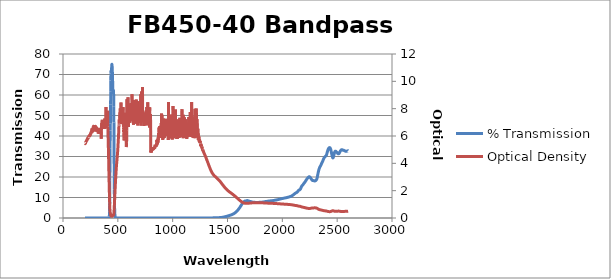
| Category | % Transmission |
|---|---|
| 2600.0 | 32.757 |
| 2599.0 | 32.808 |
| 2598.0 | 32.765 |
| 2597.0 | 32.746 |
| 2596.0 | 32.73 |
| 2595.0 | 32.687 |
| 2594.0 | 32.692 |
| 2593.0 | 32.692 |
| 2592.0 | 32.68 |
| 2591.0 | 32.648 |
| 2590.0 | 32.629 |
| 2589.0 | 32.581 |
| 2588.0 | 32.602 |
| 2587.0 | 32.576 |
| 2586.0 | 32.598 |
| 2585.0 | 32.576 |
| 2584.0 | 32.554 |
| 2583.0 | 32.555 |
| 2582.0 | 32.573 |
| 2581.0 | 32.546 |
| 2580.0 | 32.565 |
| 2579.0 | 32.551 |
| 2578.0 | 32.566 |
| 2577.0 | 32.585 |
| 2576.0 | 32.611 |
| 2575.0 | 32.604 |
| 2574.0 | 32.653 |
| 2573.0 | 32.696 |
| 2572.0 | 32.718 |
| 2571.0 | 32.729 |
| 2570.0 | 32.727 |
| 2569.0 | 32.798 |
| 2568.0 | 32.813 |
| 2567.0 | 32.829 |
| 2566.0 | 32.873 |
| 2565.0 | 32.907 |
| 2564.0 | 32.882 |
| 2563.0 | 32.908 |
| 2562.0 | 32.946 |
| 2561.0 | 32.972 |
| 2560.0 | 32.988 |
| 2559.0 | 33.055 |
| 2558.0 | 33.055 |
| 2557.0 | 33.075 |
| 2556.0 | 33.097 |
| 2555.0 | 33.092 |
| 2554.0 | 33.097 |
| 2553.0 | 33.078 |
| 2552.0 | 33.115 |
| 2551.0 | 33.125 |
| 2550.0 | 33.171 |
| 2549.0 | 33.183 |
| 2548.0 | 33.207 |
| 2547.0 | 33.255 |
| 2546.0 | 33.295 |
| 2545.0 | 33.3 |
| 2544.0 | 33.3 |
| 2543.0 | 33.312 |
| 2542.0 | 33.346 |
| 2541.0 | 33.334 |
| 2540.0 | 33.306 |
| 2539.0 | 33.317 |
| 2538.0 | 33.262 |
| 2537.0 | 33.19 |
| 2536.0 | 33.164 |
| 2535.0 | 33.084 |
| 2534.0 | 33.024 |
| 2533.0 | 32.977 |
| 2532.0 | 32.934 |
| 2531.0 | 32.797 |
| 2530.0 | 32.771 |
| 2529.0 | 32.684 |
| 2528.0 | 32.543 |
| 2527.0 | 32.449 |
| 2526.0 | 32.348 |
| 2525.0 | 32.258 |
| 2524.0 | 32.142 |
| 2523.0 | 32.041 |
| 2522.0 | 31.928 |
| 2521.0 | 31.84 |
| 2520.0 | 31.746 |
| 2519.0 | 31.653 |
| 2518.0 | 31.572 |
| 2517.0 | 31.476 |
| 2516.0 | 31.44 |
| 2515.0 | 31.382 |
| 2514.0 | 31.338 |
| 2513.0 | 31.305 |
| 2512.0 | 31.313 |
| 2511.0 | 31.304 |
| 2510.0 | 31.321 |
| 2509.0 | 31.338 |
| 2508.0 | 31.378 |
| 2507.0 | 31.413 |
| 2506.0 | 31.456 |
| 2505.0 | 31.501 |
| 2504.0 | 31.603 |
| 2503.0 | 31.598 |
| 2502.0 | 31.719 |
| 2501.0 | 31.816 |
| 2500.0 | 31.858 |
| 2499.0 | 31.937 |
| 2498.0 | 32.016 |
| 2497.0 | 32.067 |
| 2496.0 | 32.113 |
| 2495.0 | 32.178 |
| 2494.0 | 32.222 |
| 2493.0 | 32.273 |
| 2492.0 | 32.349 |
| 2491.0 | 32.392 |
| 2490.0 | 32.421 |
| 2489.0 | 32.444 |
| 2488.0 | 32.489 |
| 2487.0 | 32.522 |
| 2486.0 | 32.551 |
| 2485.0 | 32.587 |
| 2484.0 | 32.608 |
| 2483.0 | 32.59 |
| 2482.0 | 32.573 |
| 2481.0 | 32.543 |
| 2480.0 | 32.479 |
| 2479.0 | 32.408 |
| 2478.0 | 32.276 |
| 2477.0 | 32.143 |
| 2476.0 | 31.986 |
| 2475.0 | 31.8 |
| 2474.0 | 31.619 |
| 2473.0 | 31.406 |
| 2472.0 | 31.17 |
| 2471.0 | 30.949 |
| 2470.0 | 30.711 |
| 2469.0 | 30.482 |
| 2468.0 | 30.234 |
| 2467.0 | 30.002 |
| 2466.0 | 29.792 |
| 2465.0 | 29.613 |
| 2464.0 | 29.491 |
| 2463.0 | 29.386 |
| 2462.0 | 29.311 |
| 2461.0 | 29.315 |
| 2460.0 | 29.346 |
| 2459.0 | 29.416 |
| 2458.0 | 29.552 |
| 2457.0 | 29.695 |
| 2456.0 | 29.882 |
| 2455.0 | 30.121 |
| 2454.0 | 30.338 |
| 2453.0 | 30.579 |
| 2452.0 | 30.83 |
| 2451.0 | 31.082 |
| 2450.0 | 31.312 |
| 2449.0 | 31.578 |
| 2448.0 | 31.851 |
| 2447.0 | 32.119 |
| 2446.0 | 32.357 |
| 2445.0 | 32.635 |
| 2444.0 | 32.869 |
| 2443.0 | 33.086 |
| 2442.0 | 33.32 |
| 2441.0 | 33.539 |
| 2440.0 | 33.698 |
| 2439.0 | 33.816 |
| 2438.0 | 33.956 |
| 2437.0 | 34.044 |
| 2436.0 | 34.154 |
| 2435.0 | 34.191 |
| 2434.0 | 34.272 |
| 2433.0 | 34.293 |
| 2432.0 | 34.325 |
| 2431.0 | 34.339 |
| 2430.0 | 34.308 |
| 2429.0 | 34.299 |
| 2428.0 | 34.287 |
| 2427.0 | 34.217 |
| 2426.0 | 34.201 |
| 2425.0 | 34.143 |
| 2424.0 | 34.084 |
| 2423.0 | 34.009 |
| 2422.0 | 33.931 |
| 2421.0 | 33.799 |
| 2420.0 | 33.728 |
| 2419.0 | 33.62 |
| 2418.0 | 33.496 |
| 2417.0 | 33.39 |
| 2416.0 | 33.184 |
| 2415.0 | 33.12 |
| 2414.0 | 32.909 |
| 2413.0 | 32.734 |
| 2412.0 | 32.569 |
| 2411.0 | 32.359 |
| 2410.0 | 32.158 |
| 2409.0 | 31.981 |
| 2408.0 | 31.716 |
| 2407.0 | 31.563 |
| 2406.0 | 31.366 |
| 2405.0 | 31.18 |
| 2404.0 | 31.03 |
| 2403.0 | 30.867 |
| 2402.0 | 30.714 |
| 2401.0 | 30.603 |
| 2400.0 | 30.509 |
| 2399.0 | 30.469 |
| 2398.0 | 30.35 |
| 2397.0 | 30.312 |
| 2396.0 | 30.281 |
| 2395.0 | 30.214 |
| 2394.0 | 30.176 |
| 2393.0 | 30.073 |
| 2392.0 | 30.052 |
| 2391.0 | 29.99 |
| 2390.0 | 29.892 |
| 2389.0 | 29.843 |
| 2388.0 | 29.834 |
| 2387.0 | 29.739 |
| 2386.0 | 29.678 |
| 2385.0 | 29.622 |
| 2384.0 | 29.552 |
| 2383.0 | 29.488 |
| 2382.0 | 29.409 |
| 2381.0 | 29.362 |
| 2380.0 | 29.221 |
| 2379.0 | 29.159 |
| 2378.0 | 29.058 |
| 2377.0 | 28.888 |
| 2376.0 | 28.819 |
| 2375.0 | 28.669 |
| 2374.0 | 28.524 |
| 2373.0 | 28.408 |
| 2372.0 | 28.229 |
| 2371.0 | 28.111 |
| 2370.0 | 27.967 |
| 2369.0 | 27.835 |
| 2368.0 | 27.721 |
| 2367.0 | 27.578 |
| 2366.0 | 27.447 |
| 2365.0 | 27.325 |
| 2364.0 | 27.207 |
| 2363.0 | 27.122 |
| 2362.0 | 26.994 |
| 2361.0 | 26.919 |
| 2360.0 | 26.812 |
| 2359.0 | 26.697 |
| 2358.0 | 26.585 |
| 2357.0 | 26.474 |
| 2356.0 | 26.351 |
| 2355.0 | 26.226 |
| 2354.0 | 26.059 |
| 2353.0 | 25.958 |
| 2352.0 | 25.812 |
| 2351.0 | 25.698 |
| 2350.0 | 25.578 |
| 2349.0 | 25.478 |
| 2348.0 | 25.407 |
| 2347.0 | 25.279 |
| 2346.0 | 25.237 |
| 2345.0 | 25.145 |
| 2344.0 | 25.017 |
| 2343.0 | 24.96 |
| 2342.0 | 24.852 |
| 2341.0 | 24.741 |
| 2340.0 | 24.62 |
| 2339.0 | 24.476 |
| 2338.0 | 24.364 |
| 2337.0 | 24.176 |
| 2336.0 | 24.053 |
| 2335.0 | 23.863 |
| 2334.0 | 23.675 |
| 2333.0 | 23.515 |
| 2332.0 | 23.251 |
| 2331.0 | 23.083 |
| 2330.0 | 22.892 |
| 2329.0 | 22.627 |
| 2328.0 | 22.434 |
| 2327.0 | 22.188 |
| 2326.0 | 21.917 |
| 2325.0 | 21.662 |
| 2324.0 | 21.386 |
| 2323.0 | 21.124 |
| 2322.0 | 20.881 |
| 2321.0 | 20.549 |
| 2320.0 | 20.285 |
| 2319.0 | 20.012 |
| 2318.0 | 19.752 |
| 2317.0 | 19.522 |
| 2316.0 | 19.341 |
| 2315.0 | 19.162 |
| 2314.0 | 19.017 |
| 2313.0 | 18.889 |
| 2312.0 | 18.782 |
| 2311.0 | 18.683 |
| 2310.0 | 18.612 |
| 2309.0 | 18.559 |
| 2308.0 | 18.481 |
| 2307.0 | 18.434 |
| 2306.0 | 18.389 |
| 2305.0 | 18.328 |
| 2304.0 | 18.29 |
| 2303.0 | 18.244 |
| 2302.0 | 18.187 |
| 2301.0 | 18.169 |
| 2300.0 | 18.139 |
| 2299.0 | 18.107 |
| 2298.0 | 18.091 |
| 2297.0 | 18.074 |
| 2296.0 | 18.071 |
| 2295.0 | 18.076 |
| 2294.0 | 18.084 |
| 2293.0 | 18.093 |
| 2292.0 | 18.129 |
| 2291.0 | 18.118 |
| 2290.0 | 18.14 |
| 2289.0 | 18.165 |
| 2288.0 | 18.169 |
| 2287.0 | 18.197 |
| 2286.0 | 18.208 |
| 2285.0 | 18.224 |
| 2284.0 | 18.236 |
| 2283.0 | 18.236 |
| 2282.0 | 18.245 |
| 2281.0 | 18.263 |
| 2280.0 | 18.259 |
| 2279.0 | 18.25 |
| 2278.0 | 18.262 |
| 2277.0 | 18.278 |
| 2276.0 | 18.276 |
| 2275.0 | 18.306 |
| 2274.0 | 18.332 |
| 2273.0 | 18.387 |
| 2272.0 | 18.426 |
| 2271.0 | 18.499 |
| 2270.0 | 18.551 |
| 2269.0 | 18.62 |
| 2268.0 | 18.709 |
| 2267.0 | 18.775 |
| 2266.0 | 18.854 |
| 2265.0 | 18.947 |
| 2264.0 | 19.032 |
| 2263.0 | 19.112 |
| 2262.0 | 19.207 |
| 2261.0 | 19.287 |
| 2260.0 | 19.372 |
| 2259.0 | 19.481 |
| 2258.0 | 19.558 |
| 2257.0 | 19.636 |
| 2256.0 | 19.705 |
| 2255.0 | 19.787 |
| 2254.0 | 19.837 |
| 2253.0 | 19.899 |
| 2252.0 | 19.959 |
| 2251.0 | 19.995 |
| 2250.0 | 20.036 |
| 2249.0 | 20.069 |
| 2248.0 | 20.102 |
| 2247.0 | 20.103 |
| 2246.0 | 20.119 |
| 2245.0 | 20.122 |
| 2244.0 | 20.1 |
| 2243.0 | 20.095 |
| 2242.0 | 20.052 |
| 2241.0 | 20.031 |
| 2240.0 | 19.982 |
| 2239.0 | 19.963 |
| 2238.0 | 19.902 |
| 2237.0 | 19.857 |
| 2236.0 | 19.799 |
| 2235.0 | 19.732 |
| 2234.0 | 19.688 |
| 2233.0 | 19.6 |
| 2232.0 | 19.548 |
| 2231.0 | 19.496 |
| 2230.0 | 19.422 |
| 2229.0 | 19.38 |
| 2228.0 | 19.289 |
| 2227.0 | 19.25 |
| 2226.0 | 19.171 |
| 2225.0 | 19.111 |
| 2224.0 | 19.034 |
| 2223.0 | 18.981 |
| 2222.0 | 18.904 |
| 2221.0 | 18.811 |
| 2220.0 | 18.723 |
| 2219.0 | 18.647 |
| 2218.0 | 18.555 |
| 2217.0 | 18.444 |
| 2216.0 | 18.38 |
| 2215.0 | 18.274 |
| 2214.0 | 18.193 |
| 2213.0 | 18.097 |
| 2212.0 | 17.994 |
| 2211.0 | 17.917 |
| 2210.0 | 17.837 |
| 2209.0 | 17.747 |
| 2208.0 | 17.673 |
| 2207.0 | 17.606 |
| 2206.0 | 17.511 |
| 2205.0 | 17.469 |
| 2204.0 | 17.372 |
| 2203.0 | 17.321 |
| 2202.0 | 17.241 |
| 2201.0 | 17.169 |
| 2200.0 | 17.094 |
| 2199.0 | 17.024 |
| 2198.0 | 16.973 |
| 2197.0 | 16.886 |
| 2196.0 | 16.823 |
| 2195.0 | 16.747 |
| 2194.0 | 16.68 |
| 2193.0 | 16.595 |
| 2192.0 | 16.526 |
| 2191.0 | 16.451 |
| 2190.0 | 16.379 |
| 2189.0 | 16.302 |
| 2188.0 | 16.241 |
| 2187.0 | 16.189 |
| 2186.0 | 16.103 |
| 2185.0 | 16.06 |
| 2184.0 | 15.989 |
| 2183.0 | 15.931 |
| 2182.0 | 15.878 |
| 2181.0 | 15.821 |
| 2180.0 | 15.756 |
| 2179.0 | 15.696 |
| 2178.0 | 15.623 |
| 2177.0 | 15.532 |
| 2176.0 | 15.44 |
| 2175.0 | 15.35 |
| 2174.0 | 15.246 |
| 2173.0 | 15.122 |
| 2172.0 | 14.996 |
| 2171.0 | 14.876 |
| 2170.0 | 14.731 |
| 2169.0 | 14.607 |
| 2168.0 | 14.496 |
| 2167.0 | 14.369 |
| 2166.0 | 14.255 |
| 2165.0 | 14.156 |
| 2164.0 | 14.068 |
| 2163.0 | 13.985 |
| 2162.0 | 13.926 |
| 2161.0 | 13.859 |
| 2160.0 | 13.823 |
| 2159.0 | 13.789 |
| 2158.0 | 13.743 |
| 2157.0 | 13.731 |
| 2156.0 | 13.712 |
| 2155.0 | 13.701 |
| 2154.0 | 13.676 |
| 2153.0 | 13.67 |
| 2152.0 | 13.626 |
| 2151.0 | 13.601 |
| 2150.0 | 13.566 |
| 2149.0 | 13.526 |
| 2148.0 | 13.456 |
| 2147.0 | 13.41 |
| 2146.0 | 13.344 |
| 2145.0 | 13.268 |
| 2144.0 | 13.196 |
| 2143.0 | 13.113 |
| 2142.0 | 13.035 |
| 2141.0 | 12.961 |
| 2140.0 | 12.886 |
| 2139.0 | 12.806 |
| 2138.0 | 12.738 |
| 2137.0 | 12.668 |
| 2136.0 | 12.624 |
| 2135.0 | 12.559 |
| 2134.0 | 12.543 |
| 2133.0 | 12.481 |
| 2132.0 | 12.466 |
| 2131.0 | 12.434 |
| 2130.0 | 12.41 |
| 2129.0 | 12.382 |
| 2128.0 | 12.366 |
| 2127.0 | 12.344 |
| 2126.0 | 12.32 |
| 2125.0 | 12.292 |
| 2124.0 | 12.285 |
| 2123.0 | 12.235 |
| 2122.0 | 12.219 |
| 2121.0 | 12.176 |
| 2120.0 | 12.132 |
| 2119.0 | 12.1 |
| 2118.0 | 12.057 |
| 2117.0 | 12.024 |
| 2116.0 | 11.976 |
| 2115.0 | 11.941 |
| 2114.0 | 11.894 |
| 2113.0 | 11.843 |
| 2112.0 | 11.796 |
| 2111.0 | 11.759 |
| 2110.0 | 11.715 |
| 2109.0 | 11.682 |
| 2108.0 | 11.63 |
| 2107.0 | 11.592 |
| 2106.0 | 11.535 |
| 2105.0 | 11.496 |
| 2104.0 | 11.46 |
| 2103.0 | 11.417 |
| 2102.0 | 11.381 |
| 2101.0 | 11.341 |
| 2100.0 | 11.294 |
| 2099.0 | 11.256 |
| 2098.0 | 11.221 |
| 2097.0 | 11.173 |
| 2096.0 | 11.14 |
| 2095.0 | 11.103 |
| 2094.0 | 11.058 |
| 2093.0 | 11.036 |
| 2092.0 | 10.987 |
| 2091.0 | 10.952 |
| 2090.0 | 10.921 |
| 2089.0 | 10.892 |
| 2088.0 | 10.861 |
| 2087.0 | 10.823 |
| 2086.0 | 10.797 |
| 2085.0 | 10.765 |
| 2084.0 | 10.731 |
| 2083.0 | 10.709 |
| 2082.0 | 10.681 |
| 2081.0 | 10.647 |
| 2080.0 | 10.624 |
| 2079.0 | 10.6 |
| 2078.0 | 10.585 |
| 2077.0 | 10.559 |
| 2076.0 | 10.537 |
| 2075.0 | 10.512 |
| 2074.0 | 10.492 |
| 2073.0 | 10.471 |
| 2072.0 | 10.456 |
| 2071.0 | 10.437 |
| 2070.0 | 10.419 |
| 2069.0 | 10.398 |
| 2068.0 | 10.38 |
| 2067.0 | 10.364 |
| 2066.0 | 10.344 |
| 2065.0 | 10.33 |
| 2064.0 | 10.312 |
| 2063.0 | 10.296 |
| 2062.0 | 10.276 |
| 2061.0 | 10.252 |
| 2060.0 | 10.244 |
| 2059.0 | 10.23 |
| 2058.0 | 10.207 |
| 2057.0 | 10.196 |
| 2056.0 | 10.175 |
| 2055.0 | 10.16 |
| 2054.0 | 10.146 |
| 2053.0 | 10.139 |
| 2052.0 | 10.126 |
| 2051.0 | 10.105 |
| 2050.0 | 10.084 |
| 2049.0 | 10.082 |
| 2048.0 | 10.067 |
| 2047.0 | 10.059 |
| 2046.0 | 10.039 |
| 2045.0 | 10.025 |
| 2044.0 | 10.021 |
| 2043.0 | 9.994 |
| 2042.0 | 9.991 |
| 2041.0 | 9.975 |
| 2040.0 | 9.965 |
| 2039.0 | 9.947 |
| 2038.0 | 9.933 |
| 2037.0 | 9.93 |
| 2036.0 | 9.916 |
| 2035.0 | 9.907 |
| 2034.0 | 9.879 |
| 2033.0 | 9.886 |
| 2032.0 | 9.869 |
| 2031.0 | 9.856 |
| 2030.0 | 9.85 |
| 2029.0 | 9.837 |
| 2028.0 | 9.828 |
| 2027.0 | 9.818 |
| 2026.0 | 9.807 |
| 2025.0 | 9.792 |
| 2024.0 | 9.781 |
| 2023.0 | 9.768 |
| 2022.0 | 9.758 |
| 2021.0 | 9.75 |
| 2020.0 | 9.734 |
| 2019.0 | 9.729 |
| 2018.0 | 9.712 |
| 2017.0 | 9.7 |
| 2016.0 | 9.684 |
| 2015.0 | 9.677 |
| 2014.0 | 9.659 |
| 2013.0 | 9.653 |
| 2012.0 | 9.633 |
| 2011.0 | 9.633 |
| 2010.0 | 9.612 |
| 2009.0 | 9.609 |
| 2008.0 | 9.592 |
| 2007.0 | 9.573 |
| 2006.0 | 9.564 |
| 2005.0 | 9.551 |
| 2004.0 | 9.544 |
| 2003.0 | 9.526 |
| 2002.0 | 9.519 |
| 2001.0 | 9.506 |
| 2000.0 | 9.487 |
| 1999.0 | 9.485 |
| 1998.0 | 9.48 |
| 1997.0 | 9.464 |
| 1996.0 | 9.441 |
| 1995.0 | 9.439 |
| 1994.0 | 9.423 |
| 1993.0 | 9.415 |
| 1992.0 | 9.391 |
| 1991.0 | 9.39 |
| 1990.0 | 9.37 |
| 1989.0 | 9.361 |
| 1988.0 | 9.347 |
| 1987.0 | 9.328 |
| 1986.0 | 9.319 |
| 1985.0 | 9.3 |
| 1984.0 | 9.301 |
| 1983.0 | 9.273 |
| 1982.0 | 9.261 |
| 1981.0 | 9.248 |
| 1980.0 | 9.236 |
| 1979.0 | 9.222 |
| 1978.0 | 9.213 |
| 1977.0 | 9.195 |
| 1976.0 | 9.186 |
| 1975.0 | 9.162 |
| 1974.0 | 9.156 |
| 1973.0 | 9.131 |
| 1972.0 | 9.134 |
| 1971.0 | 9.112 |
| 1970.0 | 9.104 |
| 1969.0 | 9.084 |
| 1968.0 | 9.078 |
| 1967.0 | 9.061 |
| 1966.0 | 9.052 |
| 1965.0 | 9.035 |
| 1964.0 | 9.027 |
| 1963.0 | 9.014 |
| 1962.0 | 8.991 |
| 1961.0 | 8.988 |
| 1960.0 | 8.969 |
| 1959.0 | 8.962 |
| 1958.0 | 8.953 |
| 1957.0 | 8.938 |
| 1956.0 | 8.926 |
| 1955.0 | 8.913 |
| 1954.0 | 8.902 |
| 1953.0 | 8.886 |
| 1952.0 | 8.878 |
| 1951.0 | 8.87 |
| 1950.0 | 8.851 |
| 1949.0 | 8.849 |
| 1948.0 | 8.827 |
| 1947.0 | 8.827 |
| 1946.0 | 8.808 |
| 1945.0 | 8.8 |
| 1944.0 | 8.785 |
| 1943.0 | 8.781 |
| 1942.0 | 8.767 |
| 1941.0 | 8.757 |
| 1940.0 | 8.734 |
| 1939.0 | 8.733 |
| 1938.0 | 8.718 |
| 1937.0 | 8.714 |
| 1936.0 | 8.706 |
| 1935.0 | 8.695 |
| 1934.0 | 8.674 |
| 1933.0 | 8.67 |
| 1932.0 | 8.652 |
| 1931.0 | 8.64 |
| 1930.0 | 8.623 |
| 1929.0 | 8.616 |
| 1928.0 | 8.603 |
| 1927.0 | 8.61 |
| 1926.0 | 8.592 |
| 1925.0 | 8.593 |
| 1924.0 | 8.582 |
| 1923.0 | 8.571 |
| 1922.0 | 8.549 |
| 1921.0 | 8.545 |
| 1920.0 | 8.544 |
| 1919.0 | 8.544 |
| 1918.0 | 8.537 |
| 1917.0 | 8.529 |
| 1916.0 | 8.508 |
| 1915.0 | 8.505 |
| 1914.0 | 8.49 |
| 1913.0 | 8.482 |
| 1912.0 | 8.469 |
| 1911.0 | 8.476 |
| 1910.0 | 8.466 |
| 1909.0 | 8.451 |
| 1908.0 | 8.437 |
| 1907.0 | 8.423 |
| 1906.0 | 8.416 |
| 1905.0 | 8.423 |
| 1904.0 | 8.42 |
| 1903.0 | 8.427 |
| 1902.0 | 8.416 |
| 1901.0 | 8.412 |
| 1900.0 | 8.399 |
| 1899.0 | 8.411 |
| 1898.0 | 8.397 |
| 1897.0 | 8.407 |
| 1896.0 | 8.393 |
| 1895.0 | 8.385 |
| 1894.0 | 8.369 |
| 1893.0 | 8.367 |
| 1892.0 | 8.354 |
| 1891.0 | 8.35 |
| 1890.0 | 8.35 |
| 1889.0 | 8.345 |
| 1888.0 | 8.334 |
| 1887.0 | 8.329 |
| 1886.0 | 8.319 |
| 1885.0 | 8.31 |
| 1884.0 | 8.301 |
| 1883.0 | 8.296 |
| 1882.0 | 8.297 |
| 1881.0 | 8.291 |
| 1880.0 | 8.292 |
| 1879.0 | 8.265 |
| 1878.0 | 8.261 |
| 1877.0 | 8.25 |
| 1876.0 | 8.257 |
| 1875.0 | 8.241 |
| 1874.0 | 8.231 |
| 1873.0 | 8.205 |
| 1872.0 | 8.207 |
| 1871.0 | 8.194 |
| 1870.0 | 8.186 |
| 1869.0 | 8.181 |
| 1868.0 | 8.18 |
| 1867.0 | 8.174 |
| 1866.0 | 8.167 |
| 1865.0 | 8.156 |
| 1864.0 | 8.141 |
| 1863.0 | 8.141 |
| 1862.0 | 8.126 |
| 1861.0 | 8.112 |
| 1860.0 | 8.106 |
| 1859.0 | 8.108 |
| 1858.0 | 8.096 |
| 1857.0 | 8.097 |
| 1856.0 | 8.075 |
| 1855.0 | 8.07 |
| 1854.0 | 8.049 |
| 1853.0 | 8.043 |
| 1852.0 | 8.048 |
| 1851.0 | 8.042 |
| 1850.0 | 8.027 |
| 1849.0 | 7.993 |
| 1848.0 | 7.995 |
| 1847.0 | 8 |
| 1846.0 | 8.01 |
| 1845.0 | 7.997 |
| 1844.0 | 7.98 |
| 1843.0 | 7.964 |
| 1842.0 | 7.949 |
| 1841.0 | 7.948 |
| 1840.0 | 7.936 |
| 1839.0 | 7.938 |
| 1838.0 | 7.923 |
| 1837.0 | 7.911 |
| 1836.0 | 7.897 |
| 1835.0 | 7.904 |
| 1834.0 | 7.886 |
| 1833.0 | 7.877 |
| 1832.0 | 7.856 |
| 1831.0 | 7.848 |
| 1830.0 | 7.844 |
| 1829.0 | 7.839 |
| 1828.0 | 7.828 |
| 1827.0 | 7.802 |
| 1826.0 | 7.792 |
| 1825.0 | 7.794 |
| 1824.0 | 7.792 |
| 1823.0 | 7.78 |
| 1822.0 | 7.764 |
| 1821.0 | 7.757 |
| 1820.0 | 7.752 |
| 1819.0 | 7.759 |
| 1818.0 | 7.752 |
| 1817.0 | 7.74 |
| 1816.0 | 7.727 |
| 1815.0 | 7.733 |
| 1814.0 | 7.722 |
| 1813.0 | 7.717 |
| 1812.0 | 7.717 |
| 1811.0 | 7.709 |
| 1810.0 | 7.705 |
| 1809.0 | 7.703 |
| 1808.0 | 7.702 |
| 1807.0 | 7.695 |
| 1806.0 | 7.691 |
| 1805.0 | 7.695 |
| 1804.0 | 7.684 |
| 1803.0 | 7.68 |
| 1802.0 | 7.672 |
| 1801.0 | 7.675 |
| 1800.0 | 7.663 |
| 1799.0 | 7.665 |
| 1798.0 | 7.668 |
| 1797.0 | 7.656 |
| 1796.0 | 7.656 |
| 1795.0 | 7.645 |
| 1794.0 | 7.65 |
| 1793.0 | 7.64 |
| 1792.0 | 7.64 |
| 1791.0 | 7.639 |
| 1790.0 | 7.632 |
| 1789.0 | 7.634 |
| 1788.0 | 7.624 |
| 1787.0 | 7.622 |
| 1786.0 | 7.616 |
| 1785.0 | 7.614 |
| 1784.0 | 7.611 |
| 1783.0 | 7.607 |
| 1782.0 | 7.611 |
| 1781.0 | 7.605 |
| 1780.0 | 7.602 |
| 1779.0 | 7.593 |
| 1778.0 | 7.587 |
| 1777.0 | 7.593 |
| 1776.0 | 7.581 |
| 1775.0 | 7.579 |
| 1774.0 | 7.572 |
| 1773.0 | 7.573 |
| 1772.0 | 7.571 |
| 1771.0 | 7.564 |
| 1770.0 | 7.575 |
| 1769.0 | 7.564 |
| 1768.0 | 7.565 |
| 1767.0 | 7.57 |
| 1766.0 | 7.571 |
| 1765.0 | 7.578 |
| 1764.0 | 7.573 |
| 1763.0 | 7.583 |
| 1762.0 | 7.587 |
| 1761.0 | 7.585 |
| 1760.0 | 7.598 |
| 1759.0 | 7.595 |
| 1758.0 | 7.605 |
| 1757.0 | 7.611 |
| 1756.0 | 7.607 |
| 1755.0 | 7.61 |
| 1754.0 | 7.616 |
| 1753.0 | 7.624 |
| 1752.0 | 7.622 |
| 1751.0 | 7.619 |
| 1750.0 | 7.625 |
| 1749.0 | 7.621 |
| 1748.0 | 7.619 |
| 1747.0 | 7.625 |
| 1746.0 | 7.622 |
| 1745.0 | 7.625 |
| 1744.0 | 7.623 |
| 1743.0 | 7.625 |
| 1742.0 | 7.625 |
| 1741.0 | 7.625 |
| 1740.0 | 7.632 |
| 1739.0 | 7.628 |
| 1738.0 | 7.636 |
| 1737.0 | 7.648 |
| 1736.0 | 7.647 |
| 1735.0 | 7.663 |
| 1734.0 | 7.677 |
| 1733.0 | 7.685 |
| 1732.0 | 7.7 |
| 1731.0 | 7.705 |
| 1730.0 | 7.714 |
| 1729.0 | 7.733 |
| 1728.0 | 7.744 |
| 1727.0 | 7.761 |
| 1726.0 | 7.772 |
| 1725.0 | 7.787 |
| 1724.0 | 7.803 |
| 1723.0 | 7.817 |
| 1722.0 | 7.831 |
| 1721.0 | 7.846 |
| 1720.0 | 7.859 |
| 1719.0 | 7.878 |
| 1718.0 | 7.898 |
| 1717.0 | 7.924 |
| 1716.0 | 7.942 |
| 1715.0 | 7.954 |
| 1714.0 | 7.979 |
| 1713.0 | 7.996 |
| 1712.0 | 8.007 |
| 1711.0 | 8.023 |
| 1710.0 | 8.039 |
| 1709.0 | 8.046 |
| 1708.0 | 8.062 |
| 1707.0 | 8.079 |
| 1706.0 | 8.088 |
| 1705.0 | 8.098 |
| 1704.0 | 8.108 |
| 1703.0 | 8.117 |
| 1702.0 | 8.129 |
| 1701.0 | 8.136 |
| 1700.0 | 8.157 |
| 1699.0 | 8.179 |
| 1698.0 | 8.196 |
| 1697.0 | 8.219 |
| 1696.0 | 8.24 |
| 1695.0 | 8.262 |
| 1694.0 | 8.278 |
| 1693.0 | 8.297 |
| 1692.0 | 8.314 |
| 1691.0 | 8.33 |
| 1690.0 | 8.348 |
| 1689.0 | 8.363 |
| 1688.0 | 8.38 |
| 1687.0 | 8.398 |
| 1686.0 | 8.413 |
| 1685.0 | 8.428 |
| 1684.0 | 8.447 |
| 1683.0 | 8.465 |
| 1682.0 | 8.479 |
| 1681.0 | 8.49 |
| 1680.0 | 8.489 |
| 1679.0 | 8.489 |
| 1678.0 | 8.483 |
| 1677.0 | 8.475 |
| 1676.0 | 8.452 |
| 1675.0 | 8.439 |
| 1674.0 | 8.414 |
| 1673.0 | 8.4 |
| 1672.0 | 8.374 |
| 1671.0 | 8.355 |
| 1670.0 | 8.337 |
| 1669.0 | 8.326 |
| 1668.0 | 8.322 |
| 1667.0 | 8.312 |
| 1666.0 | 8.308 |
| 1665.0 | 8.307 |
| 1664.0 | 8.306 |
| 1663.0 | 8.313 |
| 1662.0 | 8.31 |
| 1661.0 | 8.295 |
| 1660.0 | 8.288 |
| 1659.0 | 8.274 |
| 1658.0 | 8.256 |
| 1657.0 | 8.227 |
| 1656.0 | 8.198 |
| 1655.0 | 8.163 |
| 1654.0 | 8.128 |
| 1653.0 | 8.084 |
| 1652.0 | 8.038 |
| 1651.0 | 7.99 |
| 1650.0 | 7.935 |
| 1649.0 | 7.884 |
| 1648.0 | 7.826 |
| 1647.0 | 7.775 |
| 1646.0 | 7.719 |
| 1645.0 | 7.66 |
| 1644.0 | 7.602 |
| 1643.0 | 7.539 |
| 1642.0 | 7.482 |
| 1641.0 | 7.421 |
| 1640.0 | 7.351 |
| 1639.0 | 7.286 |
| 1638.0 | 7.212 |
| 1637.0 | 7.137 |
| 1636.0 | 7.063 |
| 1635.0 | 6.994 |
| 1634.0 | 6.92 |
| 1633.0 | 6.845 |
| 1632.0 | 6.76 |
| 1631.0 | 6.686 |
| 1630.0 | 6.61 |
| 1629.0 | 6.526 |
| 1628.0 | 6.444 |
| 1627.0 | 6.373 |
| 1626.0 | 6.271 |
| 1625.0 | 6.194 |
| 1624.0 | 6.113 |
| 1623.0 | 6.031 |
| 1622.0 | 5.952 |
| 1621.0 | 5.867 |
| 1620.0 | 5.78 |
| 1619.0 | 5.696 |
| 1618.0 | 5.613 |
| 1617.0 | 5.535 |
| 1616.0 | 5.457 |
| 1615.0 | 5.373 |
| 1614.0 | 5.291 |
| 1613.0 | 5.206 |
| 1612.0 | 5.13 |
| 1611.0 | 5.05 |
| 1610.0 | 4.972 |
| 1609.0 | 4.901 |
| 1608.0 | 4.825 |
| 1607.0 | 4.748 |
| 1606.0 | 4.667 |
| 1605.0 | 4.594 |
| 1604.0 | 4.52 |
| 1603.0 | 4.449 |
| 1602.0 | 4.373 |
| 1601.0 | 4.305 |
| 1600.0 | 4.235 |
| 1599.0 | 4.165 |
| 1598.0 | 4.095 |
| 1597.0 | 4.027 |
| 1596.0 | 3.959 |
| 1595.0 | 3.9 |
| 1594.0 | 3.832 |
| 1593.0 | 3.767 |
| 1592.0 | 3.703 |
| 1591.0 | 3.641 |
| 1590.0 | 3.58 |
| 1589.0 | 3.522 |
| 1588.0 | 3.463 |
| 1587.0 | 3.406 |
| 1586.0 | 3.349 |
| 1585.0 | 3.294 |
| 1584.0 | 3.241 |
| 1583.0 | 3.186 |
| 1582.0 | 3.134 |
| 1581.0 | 3.081 |
| 1580.0 | 3.032 |
| 1579.0 | 2.982 |
| 1578.0 | 2.934 |
| 1577.0 | 2.887 |
| 1576.0 | 2.843 |
| 1575.0 | 2.795 |
| 1574.0 | 2.749 |
| 1573.0 | 2.705 |
| 1572.0 | 2.664 |
| 1571.0 | 2.621 |
| 1570.0 | 2.58 |
| 1569.0 | 2.539 |
| 1568.0 | 2.499 |
| 1567.0 | 2.46 |
| 1566.0 | 2.425 |
| 1565.0 | 2.388 |
| 1564.0 | 2.35 |
| 1563.0 | 2.314 |
| 1562.0 | 2.279 |
| 1561.0 | 2.245 |
| 1560.0 | 2.212 |
| 1559.0 | 2.178 |
| 1558.0 | 2.146 |
| 1557.0 | 2.116 |
| 1556.0 | 2.085 |
| 1555.0 | 2.052 |
| 1554.0 | 2.022 |
| 1553.0 | 1.993 |
| 1552.0 | 1.964 |
| 1551.0 | 1.936 |
| 1550.0 | 1.908 |
| 1549.0 | 1.879 |
| 1548.0 | 1.851 |
| 1547.0 | 1.826 |
| 1546.0 | 1.799 |
| 1545.0 | 1.775 |
| 1544.0 | 1.749 |
| 1543.0 | 1.725 |
| 1542.0 | 1.701 |
| 1541.0 | 1.678 |
| 1540.0 | 1.655 |
| 1539.0 | 1.632 |
| 1538.0 | 1.609 |
| 1537.0 | 1.589 |
| 1536.0 | 1.566 |
| 1535.0 | 1.545 |
| 1534.0 | 1.524 |
| 1533.0 | 1.504 |
| 1532.0 | 1.484 |
| 1531.0 | 1.466 |
| 1530.0 | 1.446 |
| 1529.0 | 1.426 |
| 1528.0 | 1.409 |
| 1527.0 | 1.39 |
| 1526.0 | 1.371 |
| 1525.0 | 1.352 |
| 1524.0 | 1.335 |
| 1523.0 | 1.318 |
| 1522.0 | 1.299 |
| 1521.0 | 1.282 |
| 1520.0 | 1.264 |
| 1519.0 | 1.246 |
| 1518.0 | 1.23 |
| 1517.0 | 1.213 |
| 1516.0 | 1.195 |
| 1515.0 | 1.179 |
| 1514.0 | 1.162 |
| 1513.0 | 1.147 |
| 1512.0 | 1.129 |
| 1511.0 | 1.112 |
| 1510.0 | 1.095 |
| 1509.0 | 1.08 |
| 1508.0 | 1.065 |
| 1507.0 | 1.048 |
| 1506.0 | 1.032 |
| 1505.0 | 1.017 |
| 1504.0 | 1.001 |
| 1503.0 | 0.984 |
| 1502.0 | 0.969 |
| 1501.0 | 0.953 |
| 1500.0 | 0.938 |
| 1499.0 | 0.922 |
| 1498.0 | 0.906 |
| 1497.0 | 0.891 |
| 1496.0 | 0.875 |
| 1495.0 | 0.86 |
| 1494.0 | 0.845 |
| 1493.0 | 0.83 |
| 1492.0 | 0.815 |
| 1491.0 | 0.799 |
| 1490.0 | 0.784 |
| 1489.0 | 0.77 |
| 1488.0 | 0.755 |
| 1487.0 | 0.74 |
| 1486.0 | 0.726 |
| 1485.0 | 0.712 |
| 1484.0 | 0.697 |
| 1483.0 | 0.683 |
| 1482.0 | 0.669 |
| 1481.0 | 0.656 |
| 1480.0 | 0.642 |
| 1479.0 | 0.629 |
| 1478.0 | 0.615 |
| 1477.0 | 0.602 |
| 1476.0 | 0.589 |
| 1475.0 | 0.577 |
| 1474.0 | 0.564 |
| 1473.0 | 0.552 |
| 1472.0 | 0.539 |
| 1471.0 | 0.527 |
| 1470.0 | 0.516 |
| 1469.0 | 0.504 |
| 1468.0 | 0.493 |
| 1467.0 | 0.482 |
| 1466.0 | 0.47 |
| 1465.0 | 0.459 |
| 1464.0 | 0.449 |
| 1463.0 | 0.438 |
| 1462.0 | 0.428 |
| 1461.0 | 0.418 |
| 1460.0 | 0.408 |
| 1459.0 | 0.399 |
| 1458.0 | 0.389 |
| 1457.0 | 0.38 |
| 1456.0 | 0.371 |
| 1455.0 | 0.362 |
| 1454.0 | 0.353 |
| 1453.0 | 0.345 |
| 1452.0 | 0.336 |
| 1451.0 | 0.328 |
| 1450.0 | 0.32 |
| 1449.0 | 0.313 |
| 1448.0 | 0.306 |
| 1447.0 | 0.297 |
| 1446.0 | 0.29 |
| 1445.0 | 0.284 |
| 1444.0 | 0.277 |
| 1443.0 | 0.271 |
| 1442.0 | 0.264 |
| 1441.0 | 0.258 |
| 1440.0 | 0.252 |
| 1439.0 | 0.245 |
| 1438.0 | 0.24 |
| 1437.0 | 0.234 |
| 1436.0 | 0.229 |
| 1435.0 | 0.224 |
| 1434.0 | 0.218 |
| 1433.0 | 0.213 |
| 1432.0 | 0.208 |
| 1431.0 | 0.204 |
| 1430.0 | 0.2 |
| 1429.0 | 0.195 |
| 1428.0 | 0.191 |
| 1427.0 | 0.187 |
| 1426.0 | 0.183 |
| 1425.0 | 0.18 |
| 1424.0 | 0.176 |
| 1423.0 | 0.173 |
| 1422.0 | 0.17 |
| 1421.0 | 0.166 |
| 1420.0 | 0.163 |
| 1419.0 | 0.16 |
| 1418.0 | 0.157 |
| 1417.0 | 0.154 |
| 1416.0 | 0.151 |
| 1415.0 | 0.148 |
| 1414.0 | 0.145 |
| 1413.0 | 0.143 |
| 1412.0 | 0.14 |
| 1411.0 | 0.138 |
| 1410.0 | 0.135 |
| 1409.0 | 0.133 |
| 1408.0 | 0.131 |
| 1407.0 | 0.128 |
| 1406.0 | 0.126 |
| 1405.0 | 0.124 |
| 1404.0 | 0.122 |
| 1403.0 | 0.12 |
| 1402.0 | 0.118 |
| 1401.0 | 0.115 |
| 1400.0 | 0.113 |
| 1399.0 | 0.112 |
| 1398.0 | 0.11 |
| 1397.0 | 0.108 |
| 1396.0 | 0.106 |
| 1395.0 | 0.104 |
| 1394.0 | 0.103 |
| 1393.0 | 0.101 |
| 1392.0 | 0.099 |
| 1391.0 | 0.098 |
| 1390.0 | 0.096 |
| 1389.0 | 0.094 |
| 1388.0 | 0.093 |
| 1387.0 | 0.091 |
| 1386.0 | 0.09 |
| 1385.0 | 0.088 |
| 1384.0 | 0.087 |
| 1383.0 | 0.085 |
| 1382.0 | 0.084 |
| 1381.0 | 0.082 |
| 1380.0 | 0.081 |
| 1379.0 | 0.079 |
| 1378.0 | 0.078 |
| 1377.0 | 0.076 |
| 1376.0 | 0.075 |
| 1375.0 | 0.073 |
| 1374.0 | 0.072 |
| 1373.0 | 0.071 |
| 1372.0 | 0.069 |
| 1371.0 | 0.067 |
| 1370.0 | 0.066 |
| 1369.0 | 0.064 |
| 1368.0 | 0.063 |
| 1367.0 | 0.061 |
| 1366.0 | 0.06 |
| 1365.0 | 0.058 |
| 1364.0 | 0.056 |
| 1363.0 | 0.055 |
| 1362.0 | 0.053 |
| 1361.0 | 0.052 |
| 1360.0 | 0.05 |
| 1359.0 | 0.048 |
| 1358.0 | 0.047 |
| 1357.0 | 0.045 |
| 1356.0 | 0.044 |
| 1355.0 | 0.042 |
| 1354.0 | 0.041 |
| 1353.0 | 0.039 |
| 1352.0 | 0.038 |
| 1351.0 | 0.036 |
| 1350.0 | 0.035 |
| 1349.0 | 0.033 |
| 1348.0 | 0.032 |
| 1347.0 | 0.031 |
| 1346.0 | 0.029 |
| 1345.0 | 0.028 |
| 1344.0 | 0.027 |
| 1343.0 | 0.026 |
| 1342.0 | 0.025 |
| 1341.0 | 0.024 |
| 1340.0 | 0.023 |
| 1339.0 | 0.021 |
| 1338.0 | 0.021 |
| 1337.0 | 0.019 |
| 1336.0 | 0.019 |
| 1335.0 | 0.018 |
| 1334.0 | 0.017 |
| 1333.0 | 0.016 |
| 1332.0 | 0.015 |
| 1331.0 | 0.015 |
| 1330.0 | 0.014 |
| 1329.0 | 0.013 |
| 1328.0 | 0.013 |
| 1327.0 | 0.012 |
| 1326.0 | 0.011 |
| 1325.0 | 0.011 |
| 1324.0 | 0.01 |
| 1323.0 | 0.01 |
| 1322.0 | 0.009 |
| 1321.0 | 0.009 |
| 1320.0 | 0.009 |
| 1319.0 | 0.008 |
| 1318.0 | 0.008 |
| 1317.0 | 0.007 |
| 1316.0 | 0.007 |
| 1315.0 | 0.007 |
| 1314.0 | 0.006 |
| 1313.0 | 0.006 |
| 1312.0 | 0.006 |
| 1311.0 | 0.006 |
| 1310.0 | 0.005 |
| 1309.0 | 0.005 |
| 1308.0 | 0.005 |
| 1307.0 | 0.004 |
| 1306.0 | 0.004 |
| 1305.0 | 0.004 |
| 1304.0 | 0.004 |
| 1303.0 | 0.004 |
| 1302.0 | 0.003 |
| 1301.0 | 0.003 |
| 1300.0 | 0.003 |
| 1299.0 | 0.003 |
| 1298.0 | 0.003 |
| 1297.0 | 0.003 |
| 1296.0 | 0.003 |
| 1295.0 | 0.003 |
| 1294.0 | 0.003 |
| 1293.0 | 0.002 |
| 1292.0 | 0.002 |
| 1291.0 | 0.002 |
| 1290.0 | 0.002 |
| 1289.0 | 0.002 |
| 1288.0 | 0.002 |
| 1287.0 | 0.002 |
| 1286.0 | 0.002 |
| 1285.0 | 0.002 |
| 1284.0 | 0.002 |
| 1283.0 | 0.002 |
| 1282.0 | 0.001 |
| 1281.0 | 0.001 |
| 1280.0 | 0.001 |
| 1279.0 | 0.001 |
| 1278.0 | 0.001 |
| 1277.0 | 0.001 |
| 1276.0 | 0.001 |
| 1275.0 | 0.001 |
| 1274.0 | 0.001 |
| 1273.0 | 0.001 |
| 1272.0 | 0.001 |
| 1271.0 | 0.001 |
| 1270.0 | 0.001 |
| 1269.0 | 0.001 |
| 1268.0 | 0.001 |
| 1267.0 | 0.001 |
| 1266.0 | 0.001 |
| 1265.0 | 0.001 |
| 1264.0 | 0.001 |
| 1263.0 | 0 |
| 1262.0 | 0.001 |
| 1261.0 | 0.001 |
| 1260.0 | 0.001 |
| 1259.0 | 0 |
| 1258.0 | 0 |
| 1257.0 | 0 |
| 1256.0 | 0 |
| 1255.0 | 0 |
| 1254.0 | 0 |
| 1253.0 | 0 |
| 1252.0 | 0 |
| 1251.0 | 0 |
| 1250.0 | 0 |
| 1249.0 | 0 |
| 1248.0 | 0 |
| 1247.0 | 0 |
| 1246.0 | 0 |
| 1245.0 | 0 |
| 1244.0 | 0 |
| 1243.0 | 0 |
| 1242.0 | 0 |
| 1241.0 | 0 |
| 1240.0 | 0 |
| 1239.0 | 0 |
| 1238.0 | 0 |
| 1237.0 | 0 |
| 1236.0 | 0 |
| 1235.0 | 0 |
| 1234.0 | 0 |
| 1233.0 | 0 |
| 1232.0 | 0 |
| 1231.0 | 0 |
| 1230.0 | 0 |
| 1229.0 | 0 |
| 1228.0 | 0 |
| 1227.0 | 0 |
| 1226.0 | 0 |
| 1225.0 | 0 |
| 1224.0 | 0 |
| 1223.0 | 0 |
| 1222.0 | 0 |
| 1221.0 | 0 |
| 1220.0 | 0 |
| 1219.0 | 0 |
| 1218.0 | 0 |
| 1217.0 | 0 |
| 1216.0 | 0 |
| 1215.0 | 0 |
| 1214.0 | 0 |
| 1213.0 | 0 |
| 1212.0 | 0 |
| 1211.0 | 0 |
| 1210.0 | 0 |
| 1209.0 | 0 |
| 1208.0 | 0 |
| 1207.0 | 0 |
| 1206.0 | 0 |
| 1205.0 | 0 |
| 1204.0 | 0 |
| 1203.0 | 0 |
| 1202.0 | 0 |
| 1201.0 | 0 |
| 1200.0 | 0 |
| 1199.0 | 0 |
| 1198.0 | 0 |
| 1197.0 | 0 |
| 1196.0 | 0 |
| 1195.0 | 0 |
| 1194.0 | 0 |
| 1193.0 | 0 |
| 1192.0 | 0 |
| 1191.0 | 0 |
| 1190.0 | 0 |
| 1189.0 | 0 |
| 1188.0 | 0 |
| 1187.0 | 0 |
| 1186.0 | 0 |
| 1185.0 | 0 |
| 1184.0 | 0 |
| 1183.0 | 0 |
| 1182.0 | 0 |
| 1181.0 | 0 |
| 1180.0 | 0 |
| 1179.0 | 0 |
| 1178.0 | 0 |
| 1177.0 | 0 |
| 1176.0 | 0 |
| 1175.0 | 0 |
| 1174.0 | 0 |
| 1173.0 | 0 |
| 1172.0 | 0 |
| 1171.0 | 0 |
| 1170.0 | 0 |
| 1169.0 | 0 |
| 1168.0 | 0 |
| 1167.0 | 0 |
| 1166.0 | 0 |
| 1165.0 | 0 |
| 1164.0 | 0 |
| 1163.0 | 0 |
| 1162.0 | 0 |
| 1161.0 | 0 |
| 1160.0 | 0 |
| 1159.0 | 0 |
| 1158.0 | 0 |
| 1157.0 | 0 |
| 1156.0 | 0 |
| 1155.0 | 0 |
| 1154.0 | 0 |
| 1153.0 | 0 |
| 1152.0 | 0 |
| 1151.0 | 0 |
| 1150.0 | 0 |
| 1149.0 | 0 |
| 1148.0 | 0 |
| 1147.0 | 0 |
| 1146.0 | 0 |
| 1145.0 | 0 |
| 1144.0 | 0 |
| 1143.0 | 0 |
| 1142.0 | 0 |
| 1141.0 | 0 |
| 1140.0 | 0 |
| 1139.0 | 0 |
| 1138.0 | 0 |
| 1137.0 | 0 |
| 1136.0 | 0 |
| 1135.0 | 0 |
| 1134.0 | 0 |
| 1133.0 | 0 |
| 1132.0 | 0 |
| 1131.0 | 0 |
| 1130.0 | 0 |
| 1129.0 | 0 |
| 1128.0 | 0 |
| 1127.0 | 0 |
| 1126.0 | 0 |
| 1125.0 | 0 |
| 1124.0 | 0 |
| 1123.0 | 0 |
| 1122.0 | 0 |
| 1121.0 | 0 |
| 1120.0 | 0 |
| 1119.0 | 0 |
| 1118.0 | 0 |
| 1117.0 | 0 |
| 1116.0 | 0 |
| 1115.0 | 0 |
| 1114.0 | 0 |
| 1113.0 | 0 |
| 1112.0 | 0 |
| 1111.0 | 0 |
| 1110.0 | 0 |
| 1109.0 | 0 |
| 1108.0 | 0 |
| 1107.0 | 0 |
| 1106.0 | 0 |
| 1105.0 | 0 |
| 1104.0 | 0 |
| 1103.0 | 0 |
| 1102.0 | 0 |
| 1101.0 | 0 |
| 1100.0 | 0 |
| 1099.0 | 0 |
| 1098.0 | 0 |
| 1097.0 | 0 |
| 1096.0 | 0 |
| 1095.0 | 0 |
| 1094.0 | 0 |
| 1093.0 | 0 |
| 1092.0 | 0 |
| 1091.0 | 0 |
| 1090.0 | 0 |
| 1089.0 | 0 |
| 1088.0 | 0 |
| 1087.0 | 0 |
| 1086.0 | 0 |
| 1085.0 | 0 |
| 1084.0 | 0 |
| 1083.0 | 0 |
| 1082.0 | 0 |
| 1081.0 | 0 |
| 1080.0 | 0 |
| 1079.0 | 0 |
| 1078.0 | 0 |
| 1077.0 | 0 |
| 1076.0 | 0 |
| 1075.0 | 0 |
| 1074.0 | 0 |
| 1073.0 | 0 |
| 1072.0 | 0 |
| 1071.0 | 0 |
| 1070.0 | 0 |
| 1069.0 | 0 |
| 1068.0 | 0 |
| 1067.0 | 0 |
| 1066.0 | 0 |
| 1065.0 | 0 |
| 1064.0 | 0 |
| 1063.0 | 0 |
| 1062.0 | 0 |
| 1061.0 | 0 |
| 1060.0 | 0 |
| 1059.0 | 0 |
| 1058.0 | 0 |
| 1057.0 | 0 |
| 1056.0 | 0 |
| 1055.0 | 0 |
| 1054.0 | 0 |
| 1053.0 | 0 |
| 1052.0 | 0 |
| 1051.0 | 0 |
| 1050.0 | 0 |
| 1049.0 | 0 |
| 1048.0 | 0 |
| 1047.0 | 0 |
| 1046.0 | 0 |
| 1045.0 | 0 |
| 1044.0 | 0 |
| 1043.0 | 0 |
| 1042.0 | 0 |
| 1041.0 | 0 |
| 1040.0 | 0 |
| 1039.0 | 0 |
| 1038.0 | 0 |
| 1037.0 | 0 |
| 1036.0 | 0 |
| 1035.0 | 0 |
| 1034.0 | 0 |
| 1033.0 | 0 |
| 1032.0 | 0 |
| 1031.0 | 0 |
| 1030.0 | 0 |
| 1029.0 | 0 |
| 1028.0 | 0 |
| 1027.0 | 0 |
| 1026.0 | 0 |
| 1025.0 | 0 |
| 1024.0 | 0 |
| 1023.0 | 0 |
| 1022.0 | 0 |
| 1021.0 | 0 |
| 1020.0 | 0 |
| 1019.0 | 0 |
| 1018.0 | 0 |
| 1017.0 | 0 |
| 1016.0 | 0 |
| 1015.0 | 0 |
| 1014.0 | 0 |
| 1013.0 | 0 |
| 1012.0 | 0 |
| 1011.0 | 0 |
| 1010.0 | 0 |
| 1009.0 | 0 |
| 1008.0 | 0 |
| 1007.0 | 0 |
| 1006.0 | 0 |
| 1005.0 | 0 |
| 1004.0 | 0 |
| 1003.0 | 0 |
| 1002.0 | 0 |
| 1001.0 | 0 |
| 1000.0 | 0 |
| 999.0 | 0 |
| 998.0 | 0 |
| 997.0 | 0 |
| 996.0 | 0 |
| 995.0 | 0 |
| 994.0 | 0 |
| 993.0 | 0 |
| 992.0 | 0 |
| 991.0 | 0 |
| 990.0 | 0 |
| 989.0 | 0 |
| 988.0 | 0 |
| 987.0 | 0 |
| 986.0 | 0 |
| 985.0 | 0 |
| 984.0 | 0 |
| 983.0 | 0 |
| 982.0 | 0 |
| 981.0 | 0 |
| 980.0 | 0 |
| 979.0 | 0 |
| 978.0 | 0 |
| 977.0 | 0 |
| 976.0 | 0 |
| 975.0 | 0 |
| 974.0 | 0 |
| 973.0 | 0 |
| 972.0 | 0 |
| 971.0 | 0 |
| 970.0 | 0 |
| 969.0 | 0 |
| 968.0 | 0 |
| 967.0 | 0 |
| 966.0 | 0 |
| 965.0 | 0 |
| 964.0 | 0 |
| 963.0 | 0 |
| 962.0 | 0 |
| 961.0 | 0 |
| 960.0 | 0 |
| 959.0 | 0 |
| 958.0 | 0 |
| 957.0 | 0 |
| 956.0 | 0 |
| 955.0 | 0 |
| 954.0 | 0 |
| 953.0 | 0 |
| 952.0 | 0 |
| 951.0 | 0 |
| 950.0 | 0 |
| 949.0 | 0 |
| 948.0 | 0 |
| 947.0 | 0 |
| 946.0 | 0 |
| 945.0 | 0 |
| 944.0 | 0 |
| 943.0 | 0 |
| 942.0 | 0 |
| 941.0 | 0 |
| 940.0 | 0 |
| 939.0 | 0 |
| 938.0 | 0 |
| 937.0 | 0 |
| 936.0 | 0 |
| 935.0 | 0 |
| 934.0 | 0 |
| 933.0 | 0 |
| 932.0 | 0 |
| 931.0 | 0 |
| 930.0 | 0 |
| 929.0 | 0 |
| 928.0 | 0 |
| 927.0 | 0 |
| 926.0 | 0 |
| 925.0 | 0 |
| 924.0 | 0 |
| 923.0 | 0 |
| 922.0 | 0 |
| 921.0 | 0 |
| 920.0 | 0 |
| 919.0 | 0 |
| 918.0 | 0 |
| 917.0 | 0 |
| 916.0 | 0 |
| 915.0 | 0 |
| 914.0 | 0 |
| 913.0 | 0 |
| 912.0 | 0 |
| 911.0 | 0 |
| 910.0 | 0 |
| 909.0 | 0 |
| 908.0 | 0 |
| 907.0 | 0 |
| 906.0 | 0 |
| 905.0 | 0 |
| 904.0 | 0 |
| 903.0 | 0 |
| 902.0 | 0 |
| 901.0 | 0 |
| 900.0 | 0 |
| 899.0 | 0 |
| 898.0 | 0 |
| 897.0 | 0 |
| 896.0 | 0 |
| 895.0 | 0 |
| 894.0 | 0 |
| 893.0 | 0 |
| 892.0 | 0 |
| 891.0 | 0 |
| 890.0 | 0 |
| 889.0 | 0 |
| 888.0 | 0 |
| 887.0 | 0 |
| 886.0 | 0 |
| 885.0 | 0 |
| 884.0 | 0 |
| 883.0 | 0 |
| 882.0 | 0 |
| 881.0 | 0 |
| 880.0 | 0 |
| 879.0 | 0 |
| 878.0 | 0 |
| 877.0 | 0 |
| 876.0 | 0 |
| 875.0 | 0 |
| 874.0 | 0 |
| 873.0 | 0 |
| 872.0 | 0 |
| 871.0 | 0 |
| 870.0 | 0 |
| 869.0 | 0 |
| 868.0 | 0 |
| 867.0 | 0 |
| 866.0 | 0 |
| 865.0 | 0 |
| 864.0 | 0 |
| 863.0 | 0 |
| 862.0 | 0 |
| 861.0 | 0 |
| 860.0 | 0 |
| 859.0 | 0 |
| 858.0 | 0 |
| 857.0 | 0 |
| 856.0 | 0 |
| 855.0 | 0 |
| 854.0 | 0.001 |
| 853.0 | 0 |
| 852.0 | 0 |
| 851.0 | 0 |
| 850.0 | 0.001 |
| 849.0 | 0 |
| 848.0 | 0 |
| 847.0 | 0.001 |
| 846.0 | 0.001 |
| 845.0 | 0.001 |
| 844.0 | 0.001 |
| 843.0 | 0.001 |
| 842.0 | 0.001 |
| 841.0 | 0.001 |
| 840.0 | 0 |
| 839.0 | 0.001 |
| 838.0 | 0.001 |
| 837.0 | 0.001 |
| 836.0 | 0.001 |
| 835.0 | 0.001 |
| 834.0 | 0.001 |
| 833.0 | 0.001 |
| 832.0 | 0.001 |
| 831.0 | 0.001 |
| 830.0 | 0.001 |
| 829.0 | 0.001 |
| 828.0 | 0.001 |
| 827.0 | 0.001 |
| 826.0 | 0.001 |
| 825.0 | 0.001 |
| 824.0 | 0.001 |
| 823.0 | 0.001 |
| 822.0 | 0.001 |
| 821.0 | 0.001 |
| 820.0 | 0.001 |
| 819.0 | 0.001 |
| 818.0 | 0.001 |
| 817.0 | 0.001 |
| 816.0 | 0.001 |
| 815.0 | 0.001 |
| 814.0 | 0.001 |
| 813.0 | 0.001 |
| 812.0 | 0.001 |
| 811.0 | 0.001 |
| 810.0 | 0.001 |
| 809.0 | 0.001 |
| 808.0 | 0.001 |
| 807.0 | 0.001 |
| 806.0 | 0.002 |
| 805.0 | 0.001 |
| 804.0 | 0.002 |
| 803.0 | 0.001 |
| 802.0 | 0.001 |
| 801.0 | 0.001 |
| 800.0 | 0.002 |
| 799.0 | 0 |
| 798.0 | 0 |
| 797.0 | 0 |
| 796.0 | 0 |
| 795.0 | 0 |
| 794.0 | 0 |
| 793.0 | 0 |
| 792.0 | 0 |
| 791.0 | 0 |
| 790.0 | 0 |
| 789.0 | 0 |
| 788.0 | 0 |
| 787.0 | 0 |
| 786.0 | 0 |
| 785.0 | 0 |
| 784.0 | 0 |
| 783.0 | 0 |
| 782.0 | 0 |
| 781.0 | 0 |
| 780.0 | 0 |
| 779.0 | 0 |
| 778.0 | 0 |
| 777.0 | 0 |
| 776.0 | 0 |
| 775.0 | 0 |
| 774.0 | 0 |
| 773.0 | 0 |
| 772.0 | 0 |
| 771.0 | 0 |
| 770.0 | 0 |
| 769.0 | 0 |
| 768.0 | 0 |
| 767.0 | 0 |
| 766.0 | 0 |
| 765.0 | 0 |
| 764.0 | 0 |
| 763.0 | 0 |
| 762.0 | 0 |
| 761.0 | 0 |
| 760.0 | 0 |
| 759.0 | 0 |
| 758.0 | 0 |
| 757.0 | 0 |
| 756.0 | 0 |
| 755.0 | 0 |
| 754.0 | 0 |
| 753.0 | 0 |
| 752.0 | 0 |
| 751.0 | 0 |
| 750.0 | 0 |
| 749.0 | 0 |
| 748.0 | 0 |
| 747.0 | 0 |
| 746.0 | 0 |
| 745.0 | 0 |
| 744.0 | 0 |
| 743.0 | 0 |
| 742.0 | 0 |
| 741.0 | 0 |
| 740.0 | 0 |
| 739.0 | 0 |
| 738.0 | 0 |
| 737.0 | 0 |
| 736.0 | 0 |
| 735.0 | 0 |
| 734.0 | 0 |
| 733.0 | 0 |
| 732.0 | 0 |
| 731.0 | 0 |
| 730.0 | 0 |
| 729.0 | 0 |
| 728.0 | 0 |
| 727.0 | 0 |
| 726.0 | 0 |
| 725.0 | 0 |
| 724.0 | 0 |
| 723.0 | 0 |
| 722.0 | 0 |
| 721.0 | 0 |
| 720.0 | 0 |
| 719.0 | 0 |
| 718.0 | 0 |
| 717.0 | 0 |
| 716.0 | 0 |
| 715.0 | 0 |
| 714.0 | 0 |
| 713.0 | 0 |
| 712.0 | 0 |
| 711.0 | 0 |
| 710.0 | 0 |
| 709.0 | 0 |
| 708.0 | 0 |
| 707.0 | 0 |
| 706.0 | 0 |
| 705.0 | 0 |
| 704.0 | 0 |
| 703.0 | 0 |
| 702.0 | 0 |
| 701.0 | 0 |
| 700.0 | 0 |
| 699.0 | 0 |
| 698.0 | 0 |
| 697.0 | 0 |
| 696.0 | 0 |
| 695.0 | 0 |
| 694.0 | 0 |
| 693.0 | 0 |
| 692.0 | 0 |
| 691.0 | 0 |
| 690.0 | 0 |
| 689.0 | 0 |
| 688.0 | 0 |
| 687.0 | 0 |
| 686.0 | 0 |
| 685.0 | 0 |
| 684.0 | 0 |
| 683.0 | 0 |
| 682.0 | 0 |
| 681.0 | 0 |
| 680.0 | 0 |
| 679.0 | 0 |
| 678.0 | 0 |
| 677.0 | 0 |
| 676.0 | 0 |
| 675.0 | 0 |
| 674.0 | 0 |
| 673.0 | 0 |
| 672.0 | 0 |
| 671.0 | 0 |
| 670.0 | 0 |
| 669.0 | 0 |
| 668.0 | 0 |
| 667.0 | 0 |
| 666.0 | 0 |
| 665.0 | 0 |
| 664.0 | 0 |
| 663.0 | 0 |
| 662.0 | 0 |
| 661.0 | 0 |
| 660.0 | 0 |
| 659.0 | 0 |
| 658.0 | 0 |
| 657.0 | 0 |
| 656.0 | 0 |
| 655.0 | 0 |
| 654.0 | 0 |
| 653.0 | 0 |
| 652.0 | 0 |
| 651.0 | 0 |
| 650.0 | 0 |
| 649.0 | 0 |
| 648.0 | 0 |
| 647.0 | 0 |
| 646.0 | 0 |
| 645.0 | 0 |
| 644.0 | 0 |
| 643.0 | 0 |
| 642.0 | 0 |
| 641.0 | 0 |
| 640.0 | 0 |
| 639.0 | 0 |
| 638.0 | 0 |
| 637.0 | 0 |
| 636.0 | 0 |
| 635.0 | 0 |
| 634.0 | 0 |
| 633.0 | 0 |
| 632.0 | 0 |
| 631.0 | 0 |
| 630.0 | 0 |
| 629.0 | 0 |
| 628.0 | 0 |
| 627.0 | 0 |
| 626.0 | 0 |
| 625.0 | 0 |
| 624.0 | 0 |
| 623.0 | 0 |
| 622.0 | 0 |
| 621.0 | 0 |
| 620.0 | 0 |
| 619.0 | 0 |
| 618.0 | 0 |
| 617.0 | 0 |
| 616.0 | 0 |
| 615.0 | 0 |
| 614.0 | 0 |
| 613.0 | 0 |
| 612.0 | 0 |
| 611.0 | 0 |
| 610.0 | 0 |
| 609.0 | 0 |
| 608.0 | 0 |
| 607.0 | 0 |
| 606.0 | 0 |
| 605.0 | 0 |
| 604.0 | 0 |
| 603.0 | 0 |
| 602.0 | 0 |
| 601.0 | 0 |
| 600.0 | 0 |
| 599.0 | 0 |
| 598.0 | 0 |
| 597.0 | 0 |
| 596.0 | 0 |
| 595.0 | 0 |
| 594.0 | 0 |
| 593.0 | 0 |
| 592.0 | 0 |
| 591.0 | 0 |
| 590.0 | 0 |
| 589.0 | 0 |
| 588.0 | 0 |
| 587.0 | 0 |
| 586.0 | 0 |
| 585.0 | 0 |
| 584.0 | 0 |
| 583.0 | 0 |
| 582.0 | 0 |
| 581.0 | 0 |
| 580.0 | 0 |
| 579.0 | 0.001 |
| 578.0 | 0.001 |
| 577.0 | 0 |
| 576.0 | 0 |
| 575.0 | 0 |
| 574.0 | 0 |
| 573.0 | 0 |
| 572.0 | 0 |
| 571.0 | 0 |
| 570.0 | 0 |
| 569.0 | 0 |
| 568.0 | 0 |
| 567.0 | 0 |
| 566.0 | 0 |
| 565.0 | 0 |
| 564.0 | 0 |
| 563.0 | 0 |
| 562.0 | 0 |
| 561.0 | 0 |
| 560.0 | 0 |
| 559.0 | 0 |
| 558.0 | 0 |
| 557.0 | 0 |
| 556.0 | 0 |
| 555.0 | 0 |
| 554.0 | 0 |
| 553.0 | 0 |
| 552.0 | 0 |
| 551.0 | 0 |
| 550.0 | 0 |
| 549.0 | 0 |
| 548.0 | 0 |
| 547.0 | 0 |
| 546.0 | 0 |
| 545.0 | 0 |
| 544.0 | 0 |
| 543.0 | 0 |
| 542.0 | 0 |
| 541.0 | 0 |
| 540.0 | 0 |
| 539.0 | 0 |
| 538.0 | 0 |
| 537.0 | 0 |
| 536.0 | 0 |
| 535.0 | 0 |
| 534.0 | 0 |
| 533.0 | 0 |
| 532.0 | 0 |
| 531.0 | 0 |
| 530.0 | 0 |
| 529.0 | 0 |
| 528.0 | 0 |
| 527.0 | 0 |
| 526.0 | 0 |
| 525.0 | 0 |
| 524.0 | 0 |
| 523.0 | 0 |
| 522.0 | 0 |
| 521.0 | 0 |
| 520.0 | 0 |
| 519.0 | 0 |
| 518.0 | 0 |
| 517.0 | 0 |
| 516.0 | 0 |
| 515.0 | 0 |
| 514.0 | 0 |
| 513.0 | 0 |
| 512.0 | 0 |
| 511.0 | 0 |
| 510.0 | 0 |
| 509.0 | 0 |
| 508.0 | 0 |
| 507.0 | 0 |
| 506.0 | 0 |
| 505.0 | 0 |
| 504.0 | 0 |
| 503.0 | 0 |
| 502.0 | 0 |
| 501.0 | 0.001 |
| 500.0 | 0.001 |
| 499.0 | 0.001 |
| 498.0 | 0.001 |
| 497.0 | 0.002 |
| 496.0 | 0.002 |
| 495.0 | 0.003 |
| 494.0 | 0.004 |
| 493.0 | 0.005 |
| 492.0 | 0.006 |
| 491.0 | 0.007 |
| 490.0 | 0.009 |
| 489.0 | 0.011 |
| 488.0 | 0.014 |
| 487.0 | 0.018 |
| 486.0 | 0.023 |
| 485.0 | 0.029 |
| 484.0 | 0.039 |
| 483.0 | 0.052 |
| 482.0 | 0.07 |
| 481.0 | 0.096 |
| 480.0 | 0.133 |
| 479.0 | 0.187 |
| 478.0 | 0.266 |
| 477.0 | 0.38 |
| 476.0 | 0.553 |
| 475.0 | 0.812 |
| 474.0 | 1.206 |
| 473.0 | 1.808 |
| 472.0 | 2.72 |
| 471.0 | 4.12 |
| 470.0 | 6.258 |
| 469.0 | 9.398 |
| 468.0 | 13.968 |
| 467.0 | 20.312 |
| 466.0 | 28.336 |
| 465.0 | 37.512 |
| 464.0 | 46.561 |
| 463.0 | 54.302 |
| 462.0 | 59.548 |
| 461.0 | 62.117 |
| 460.0 | 62.553 |
| 459.0 | 61.922 |
| 458.0 | 61.113 |
| 457.0 | 60.695 |
| 456.0 | 61.014 |
| 455.0 | 62.082 |
| 454.0 | 63.755 |
| 453.0 | 65.829 |
| 452.0 | 67.953 |
| 451.0 | 69.898 |
| 450.0 | 71.581 |
| 449.0 | 72.935 |
| 448.0 | 73.944 |
| 447.0 | 74.664 |
| 446.0 | 74.969 |
| 445.0 | 74.746 |
| 444.0 | 73.974 |
| 443.0 | 72.817 |
| 442.0 | 71.698 |
| 441.0 | 71.083 |
| 440.0 | 71.19 |
| 439.0 | 71.76 |
| 438.0 | 71.98 |
| 437.0 | 70.63 |
| 436.0 | 67.085 |
| 435.0 | 61.625 |
| 434.0 | 55.497 |
| 433.0 | 50.125 |
| 432.0 | 45.947 |
| 431.0 | 42.655 |
| 430.0 | 39.064 |
| 429.0 | 33.761 |
| 428.0 | 26.338 |
| 427.0 | 18.181 |
| 426.0 | 11.009 |
| 425.0 | 5.97 |
| 424.0 | 3.002 |
| 423.0 | 1.436 |
| 422.0 | 0.679 |
| 421.0 | 0.315 |
| 420.0 | 0.146 |
| 419.0 | 0.066 |
| 418.0 | 0.029 |
| 417.0 | 0.012 |
| 416.0 | 0.005 |
| 415.0 | 0.002 |
| 414.0 | 0.001 |
| 413.0 | 0 |
| 412.0 | 0 |
| 411.0 | 0 |
| 410.0 | 0 |
| 409.0 | 0 |
| 408.0 | 0 |
| 407.0 | 0 |
| 406.0 | 0 |
| 405.0 | 0 |
| 404.0 | 0 |
| 403.0 | 0 |
| 402.0 | 0 |
| 401.0 | 0 |
| 400.0 | 0 |
| 399.0 | 0 |
| 398.0 | 0 |
| 397.0 | 0 |
| 396.0 | 0 |
| 395.0 | 0 |
| 394.0 | 0 |
| 393.0 | 0 |
| 392.0 | 0 |
| 391.0 | 0 |
| 390.0 | 0 |
| 389.0 | 0 |
| 388.0 | 0 |
| 387.0 | 0 |
| 386.0 | 0 |
| 385.0 | 0 |
| 384.0 | 0 |
| 383.0 | 0 |
| 382.0 | 0 |
| 381.0 | 0 |
| 380.0 | 0 |
| 379.0 | 0 |
| 378.0 | 0 |
| 377.0 | 0 |
| 376.0 | 0 |
| 375.0 | 0 |
| 374.0 | 0 |
| 373.0 | 0 |
| 372.0 | 0 |
| 371.0 | 0 |
| 370.0 | 0 |
| 369.0 | 0 |
| 368.0 | 0 |
| 367.0 | 0 |
| 366.0 | 0 |
| 365.0 | 0 |
| 364.0 | 0 |
| 363.0 | 0 |
| 362.0 | 0 |
| 361.0 | 0 |
| 360.0 | 0 |
| 359.0 | 0 |
| 358.0 | 0 |
| 357.0 | 0 |
| 356.0 | 0 |
| 355.0 | 0 |
| 354.0 | 0 |
| 353.0 | 0 |
| 352.0 | 0 |
| 351.0 | 0 |
| 350.0 | 0 |
| 349.0 | 0 |
| 348.0 | 0 |
| 347.0 | 0 |
| 346.0 | 0 |
| 345.0 | 0 |
| 344.0 | 0 |
| 343.0 | 0 |
| 342.0 | 0 |
| 341.0 | 0 |
| 340.0 | 0 |
| 339.0 | 0 |
| 338.0 | 0 |
| 337.0 | 0 |
| 336.0 | 0 |
| 335.0 | 0 |
| 334.0 | 0 |
| 333.0 | 0 |
| 332.0 | 0 |
| 331.0 | 0 |
| 330.0 | 0 |
| 329.0 | 0 |
| 328.0 | 0 |
| 327.0 | 0 |
| 326.0 | 0 |
| 325.0 | 0 |
| 324.0 | 0 |
| 323.0 | 0 |
| 322.0 | 0 |
| 321.0 | 0 |
| 320.0 | 0 |
| 319.0 | 0 |
| 318.0 | 0 |
| 317.0 | 0 |
| 316.0 | 0 |
| 315.0 | 0 |
| 314.0 | 0 |
| 313.0 | 0 |
| 312.0 | 0 |
| 311.0 | 0 |
| 310.0 | 0 |
| 309.0 | 0 |
| 308.0 | 0 |
| 307.0 | 0 |
| 306.0 | 0 |
| 305.0 | 0 |
| 304.0 | 0 |
| 303.0 | 0 |
| 302.0 | 0 |
| 301.0 | 0 |
| 300.0 | 0 |
| 299.0 | 0 |
| 298.0 | 0 |
| 297.0 | 0 |
| 296.0 | 0 |
| 295.0 | 0 |
| 294.0 | 0 |
| 293.0 | 0 |
| 292.0 | 0 |
| 291.0 | 0 |
| 290.0 | 0 |
| 289.0 | 0 |
| 288.0 | 0 |
| 287.0 | 0 |
| 286.0 | 0 |
| 285.0 | 0 |
| 284.0 | 0 |
| 283.0 | 0 |
| 282.0 | 0 |
| 281.0 | 0 |
| 280.0 | 0 |
| 279.0 | 0 |
| 278.0 | 0 |
| 277.0 | 0 |
| 276.0 | 0 |
| 275.0 | 0 |
| 274.0 | 0 |
| 273.0 | 0 |
| 272.0 | 0 |
| 271.0 | 0 |
| 270.0 | 0 |
| 269.0 | 0 |
| 268.0 | 0 |
| 267.0 | 0 |
| 266.0 | 0 |
| 265.0 | 0 |
| 264.0 | 0 |
| 263.0 | 0 |
| 262.0 | 0 |
| 261.0 | 0 |
| 260.0 | 0 |
| 259.0 | 0 |
| 258.0 | 0 |
| 257.0 | 0 |
| 256.0 | 0 |
| 255.0 | 0 |
| 254.0 | 0 |
| 253.0 | 0 |
| 252.0 | 0 |
| 251.0 | 0 |
| 250.0 | 0 |
| 249.0 | 0 |
| 248.0 | 0 |
| 247.0 | 0 |
| 246.0 | 0 |
| 245.0 | 0 |
| 244.0 | 0 |
| 243.0 | 0 |
| 242.0 | 0 |
| 241.0 | 0 |
| 240.0 | 0 |
| 239.0 | 0 |
| 238.0 | 0 |
| 237.0 | 0 |
| 236.0 | 0 |
| 235.0 | 0 |
| 234.0 | 0 |
| 233.0 | 0 |
| 232.0 | 0 |
| 231.0 | 0 |
| 230.0 | 0 |
| 229.0 | 0 |
| 228.0 | 0 |
| 227.0 | 0 |
| 226.0 | 0 |
| 225.0 | 0 |
| 224.0 | 0 |
| 223.0 | 0 |
| 222.0 | 0 |
| 221.0 | 0 |
| 220.0 | 0 |
| 219.0 | 0 |
| 218.0 | 0 |
| 217.0 | 0 |
| 216.0 | 0 |
| 215.0 | 0 |
| 214.0 | 0 |
| 213.0 | 0 |
| 212.0 | 0 |
| 211.0 | 0 |
| 210.0 | 0 |
| 209.0 | 0 |
| 208.0 | 0 |
| 207.0 | 0 |
| 206.0 | 0 |
| 205.0 | 0 |
| 204.0 | 0 |
| 203.0 | 0 |
| 202.0 | 0 |
| 201.0 | 0 |